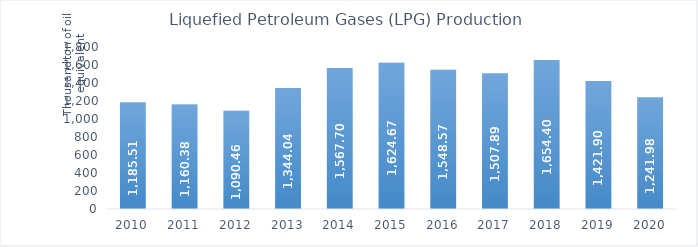
| Category | Liquefied Petroleum Gases (LPG) Production* |
|---|---|
| 2010.0 | 1185.51 |
| 2011.0 | 1160.38 |
| 2012.0 | 1090.46 |
| 2013.0 | 1344.04 |
| 2014.0 | 1567.7 |
| 2015.0 | 1624.67 |
| 2016.0 | 1548.57 |
| 2017.0 | 1507.89 |
| 2018.0 | 1654.4 |
| 2019.0 | 1421.9 |
| 2020.0 | 1241.98 |